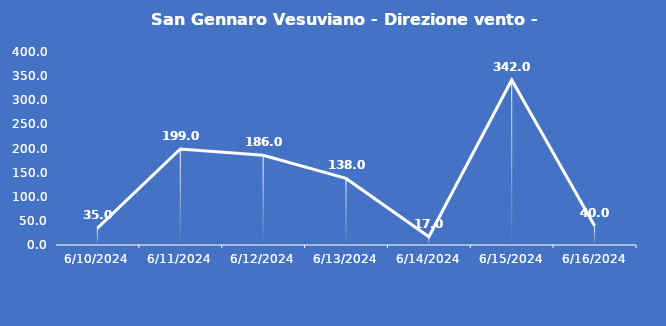
| Category | San Gennaro Vesuviano - Direzione vento - Grezzo (°N) |
|---|---|
| 6/10/24 | 35 |
| 6/11/24 | 199 |
| 6/12/24 | 186 |
| 6/13/24 | 138 |
| 6/14/24 | 17 |
| 6/15/24 | 342 |
| 6/16/24 | 40 |